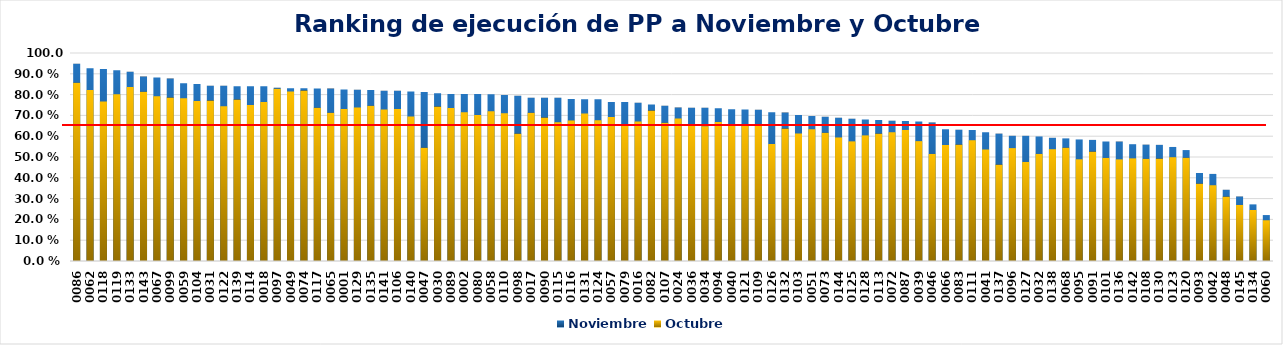
| Category | Noviembre | Octubre |
|---|---|---|
| 0086 | 0.948 | 0.857 |
| 0062 | 0.927 | 0.822 |
| 0118 | 0.923 | 0.767 |
| 0119 | 0.917 | 0.802 |
| 0133 | 0.91 | 0.836 |
| 0143 | 0.886 | 0.814 |
| 0067 | 0.882 | 0.792 |
| 0099 | 0.877 | 0.786 |
| 0059 | 0.855 | 0.782 |
| 0104 | 0.851 | 0.769 |
| 0031 | 0.843 | 0.771 |
| 0122 | 0.843 | 0.744 |
| 0139 | 0.841 | 0.776 |
| 0114 | 0.84 | 0.75 |
| 0018 | 0.84 | 0.764 |
| 0097 | 0.833 | 0.828 |
| 0049 | 0.831 | 0.815 |
| 0074 | 0.831 | 0.819 |
| 0117 | 0.829 | 0.737 |
| 0065 | 0.829 | 0.713 |
| 0001 | 0.825 | 0.731 |
| 0129 | 0.823 | 0.738 |
| 0135 | 0.822 | 0.746 |
| 0141 | 0.819 | 0.728 |
| 0106 | 0.818 | 0.731 |
| 0140 | 0.815 | 0.695 |
| 0047 | 0.812 | 0.545 |
| 0030 | 0.806 | 0.742 |
| 0089 | 0.803 | 0.735 |
| 0002 | 0.803 | 0.715 |
| 0080 | 0.803 | 0.702 |
| 0058 | 0.801 | 0.72 |
| 0110 | 0.798 | 0.711 |
| 0098 | 0.794 | 0.612 |
| 0017 | 0.785 | 0.713 |
| 0090 | 0.785 | 0.689 |
| 0115 | 0.785 | 0.668 |
| 0116 | 0.779 | 0.676 |
| 0131 | 0.778 | 0.709 |
| 0124 | 0.777 | 0.677 |
| 0057 | 0.765 | 0.693 |
| 0079 | 0.764 | 0.65 |
| 0016 | 0.761 | 0.671 |
| 0082 | 0.752 | 0.723 |
| 0107 | 0.746 | 0.665 |
| 0024 | 0.738 | 0.685 |
| 0036 | 0.737 | 0.656 |
| 0034 | 0.736 | 0.647 |
| 0094 | 0.735 | 0.668 |
| 0040 | 0.729 | 0.654 |
| 0121 | 0.729 | 0.653 |
| 0109 | 0.727 | 0.657 |
| 0126 | 0.715 | 0.562 |
| 0132 | 0.714 | 0.637 |
| 0103 | 0.702 | 0.613 |
| 0051 | 0.698 | 0.633 |
| 0073 | 0.694 | 0.617 |
| 0144 | 0.688 | 0.594 |
| 0125 | 0.684 | 0.575 |
| 0128 | 0.681 | 0.604 |
| 0113 | 0.677 | 0.613 |
| 0072 | 0.674 | 0.619 |
| 0087 | 0.673 | 0.629 |
| 0039 | 0.671 | 0.576 |
| 0046 | 0.665 | 0.515 |
| 0066 | 0.633 | 0.557 |
| 0083 | 0.63 | 0.56 |
| 0111 | 0.63 | 0.581 |
| 0041 | 0.619 | 0.536 |
| 0137 | 0.612 | 0.463 |
| 0096 | 0.602 | 0.543 |
| 0127 | 0.602 | 0.476 |
| 0032 | 0.599 | 0.515 |
| 0138 | 0.592 | 0.537 |
| 0068 | 0.59 | 0.545 |
| 0095 | 0.584 | 0.489 |
| 0091 | 0.582 | 0.526 |
| 0101 | 0.575 | 0.496 |
| 0136 | 0.574 | 0.489 |
| 0142 | 0.562 | 0.493 |
| 0108 | 0.559 | 0.491 |
| 0130 | 0.558 | 0.492 |
| 0123 | 0.548 | 0.499 |
| 0120 | 0.533 | 0.496 |
| 0093 | 0.423 | 0.372 |
| 0042 | 0.419 | 0.364 |
| 0048 | 0.342 | 0.31 |
| 0145 | 0.31 | 0.27 |
| 0134 | 0.272 | 0.245 |
| 0060 | 0.221 | 0.196 |